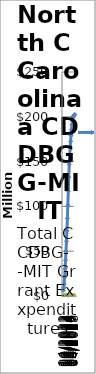
| Category | Projected Expenditures | Actual Expenditure |
|---|---|---|
| 04/2022 | 6156348.257 | 1084981.7 |
| 07/2022 | 8983625.807 | 1084981.7 |
| 10/2022 | 13120903.358 | 1084981.7 |
| 01/2023 | 21040576.974 | 1084981.7 |
| 04/2023 | 30465080.709 | 1084981.7 |
| 07/2023 | 39930436.771 | 1084981.7 |
| 10/2023 | 50069225.98 | 1084981.7 |
| 01/2023 | 61130688.181 | 1084981.7 |
| 04/2023 | 72799792.374 | 1084981.7 |
| 07/2023 | 86547034.099 | 1084981.7 |
| 10/2023 | 101270629.424 | 1084981.7 |
| 01/2024 | 116993248.574 | 1084981.7 |
| 04/2024 | 132621004.612 | 1084981.7 |
| 07/2024 | 146748760.649 | 1084981.7 |
| 10/2024 | 156627619.047 | 1084981.7 |
| 01/2025 | 165023316.109 | 1084981.7 |
| 04/2025 | 172585231.776 | 1084981.7 |
| 07/2025 | 179277691.887 | 1084981.7 |
| 10/2026 | 185970151.999 | 1084981.7 |
| 01/2027 | 191065386.295 | 1084981.7 |
| 04/2027 | 195560621.592 | 1084981.7 |
| 07/2027 | 199160316.666 | 1084981.7 |
| 10/2027 | 200435301.551 | 1084981.7 |
| 01/2028 | 201560286.436 | 1084981.7 |
| 04/2028 | 202115866.092 | 1084981.7 |
| 07/2028 | 202685999.747 | 1084981.7 |